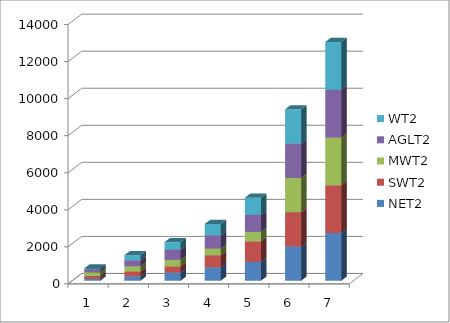
| Category | NET2 | SWT2 | MWT2 | AGLT2 | WT2 |
|---|---|---|---|---|---|
| 0 | 103 | 143 | 213 | 155 | 51 |
| 1 | 244 | 256 | 282 | 322 | 275 |
| 2 | 445 | 328 | 358 | 542 | 412.5 |
| 3 | 727 | 650 | 362 | 709 | 618.75 |
| 4 | 1024 | 1103 | 512 | 914 | 928.125 |
| 5 | 1851 | 1851 | 1851 | 1851 | 1851 |
| 6 | 2577.6 | 2577.6 | 2577.6 | 2577.6 | 2577.6 |